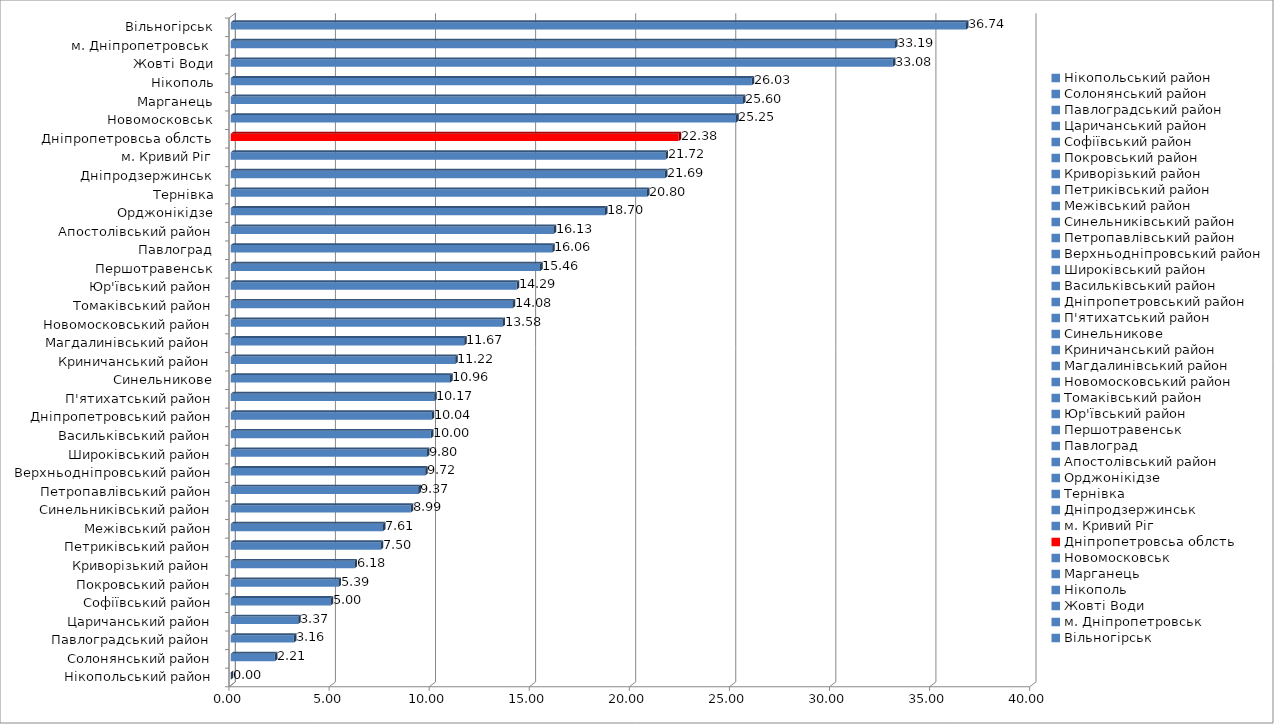
| Category | Series 0 |
|---|---|
| Нікопольський район | 0 |
| Солонянський район | 2.206 |
| Павлоградський район | 3.157 |
| Царичанський район | 3.37 |
| Софіївський район | 5 |
| Покровський район | 5.386 |
| Криворізький район | 6.185 |
| Петриківський район | 7.498 |
| Межівський район | 7.609 |
| Синельниківський район | 8.99 |
| Петропавлівський район | 9.374 |
| Верхньодніпровський район | 9.721 |
| Широківський район | 9.804 |
| Васильківський район | 10 |
| Дніпропетровський район | 10.044 |
| П'ятихатський район | 10.17 |
| Синельникове | 10.96 |
| Криничанський район | 11.217 |
| Магдалинівський район | 11.667 |
| Новомосковський район | 13.58 |
| Томаківський район | 14.083 |
| Юр'ївський район | 14.285 |
| Першотравенськ | 15.456 |
| Павлоград | 16.064 |
| Апостолівський район | 16.13 |
| Орджонікідзе | 18.697 |
| Тернівка | 20.796 |
| Дніпродзержинськ | 21.693 |
| м. Кривий Ріг | 21.72 |
| Дніпропетровсьа облсть | 22.379 |
| Новомосковськ | 25.248 |
| Марганець | 25.596 |
| Нікополь | 26.028 |
| Жовті Води | 33.082 |
| м. Дніпропетровськ  | 33.19 |
| Вільногірськ | 36.737 |